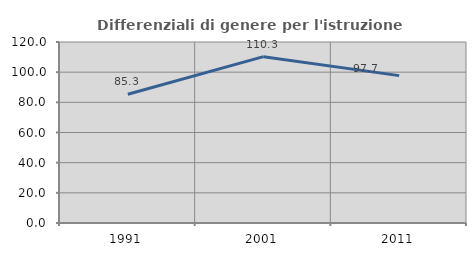
| Category | Differenziali di genere per l'istruzione superiore |
|---|---|
| 1991.0 | 85.344 |
| 2001.0 | 110.294 |
| 2011.0 | 97.701 |